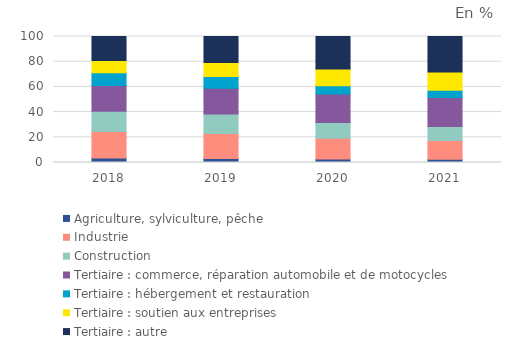
| Category | Agriculture, sylviculture, pêche | Industrie | Construction | Tertiaire : commerce, réparation automobile et de motocycles | Tertiaire : hébergement et restauration | Tertiaire : soutien aux entreprises | Tertiaire : autre |
|---|---|---|---|---|---|---|---|
| 2018.0 | 3.5 | 21.1 | 16.1 | 20.5 | 10.1 | 9.6 | 19.1 |
| 2019.0 | 3.1 | 19.9 | 15.4 | 20.6 | 9.3 | 11 | 20.7 |
| 2020.0 | 2.8 | 16.4 | 12.6 | 22.5 | 6.6 | 13.4 | 25.7 |
| 2021.0 | 2.5 | 14.9 | 11.2 | 22.9 | 5.8 | 14.5 | 28.2 |